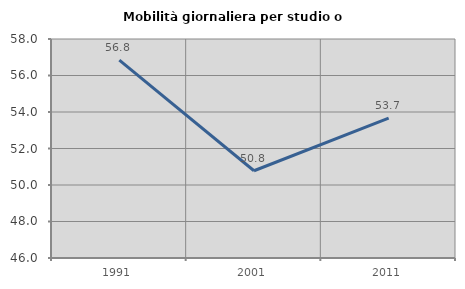
| Category | Mobilità giornaliera per studio o lavoro |
|---|---|
| 1991.0 | 56.843 |
| 2001.0 | 50.781 |
| 2011.0 | 53.668 |